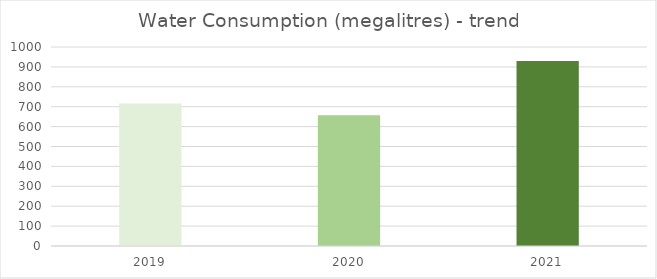
| Category | Series 0 |
|---|---|
| 0 | 716.16 |
| 1 | 657.37 |
| 2 | 929.96 |